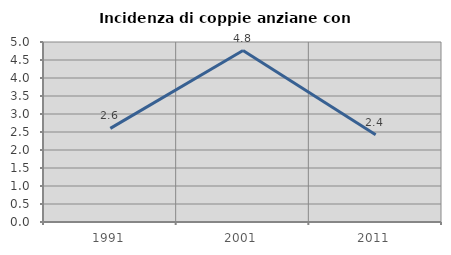
| Category | Incidenza di coppie anziane con figli |
|---|---|
| 1991.0 | 2.601 |
| 2001.0 | 4.762 |
| 2011.0 | 2.424 |